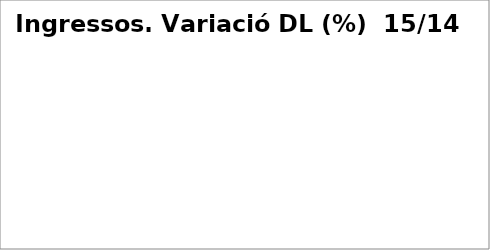
| Category | Series 0 |
|---|---|
| Impostos directes | 0.058 |
| Impostos indirectes | 0.108 |
| Taxes, preus públics i altres ingressos | -0.017 |
| Transferències corrents | 0.056 |
| Ingressos patrimonials | 0.211 |
| Venda d'inversions reals | 0.456 |
| Transferències de capital | -0.064 |
| Actius financers* | 0 |
| Passius financers | -0.007 |